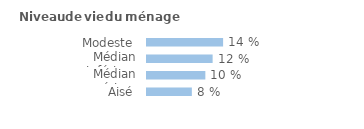
| Category | Series 0 |
|---|---|
| Modeste | 0.135 |
| Médian inférieur | 0.116 |
| Médian supérieur | 0.104 |
| Aisé | 0.08 |